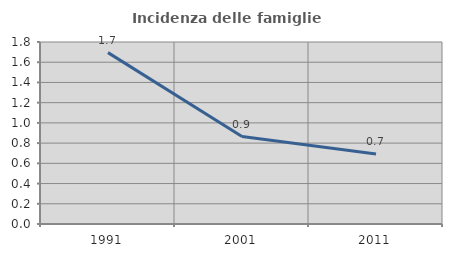
| Category | Incidenza delle famiglie numerose |
|---|---|
| 1991.0 | 1.695 |
| 2001.0 | 0.865 |
| 2011.0 | 0.693 |